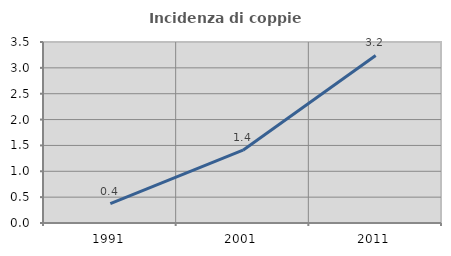
| Category | Incidenza di coppie miste |
|---|---|
| 1991.0 | 0.375 |
| 2001.0 | 1.407 |
| 2011.0 | 3.24 |